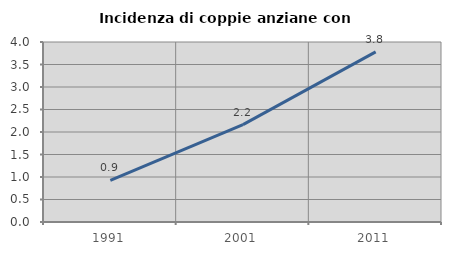
| Category | Incidenza di coppie anziane con figli |
|---|---|
| 1991.0 | 0.926 |
| 2001.0 | 2.165 |
| 2011.0 | 3.782 |